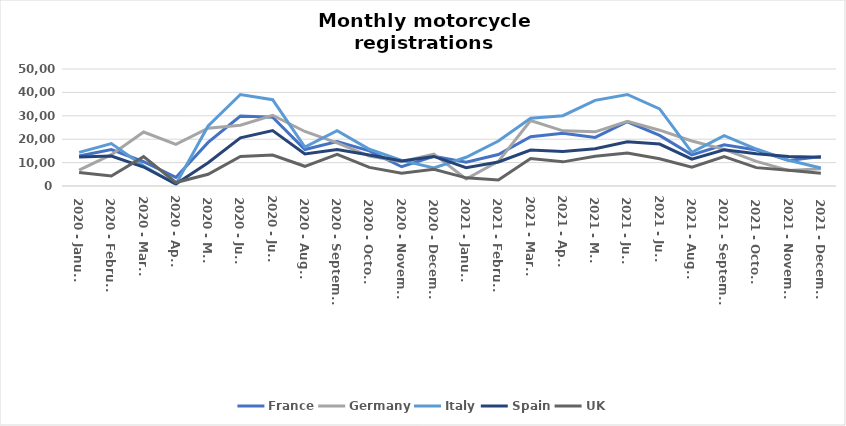
| Category | France | Germany | Italy | Spain | UK |
|---|---|---|---|---|---|
| 2020 - January | 12782 | 6827 | 14357 | 12352 | 5748 |
| 2020 - February | 15581 | 13392 | 18147 | 12823 | 4280 |
| 2020 - March | 10371 | 23074 | 8522 | 8100 | 12565 |
| 2020 - April | 3654 | 17763 | 811 | 817 | 1480 |
| 2020 - May | 18629 | 24681 | 25674 | 9918 | 5019 |
| 2020 - June | 29864 | 25970 | 39090 | 20589 | 12621 |
| 2020 - July | 29394 | 30228 | 36892 | 23718 | 13207 |
| 2020 - August | 15567 | 23296 | 16670 | 13690 | 8423 |
| 2020 - September | 18981 | 18397 | 23614 | 15637 | 13487 |
| 2020 - October | 15030 | 12775 | 15688 | 13206 | 7960 |
| 2020 - November | 8235 | 10351 | 10949 | 10672 | 5445 |
| 2020 - December | 12654 | 13672 | 7677 | 12636 | 7111 |
| 2021 - January | 10185 | 2979 | 12289 | 7801 | 3478 |
| 2021 - February | 13476 | 10545 | 19243 | 10287 | 2586 |
| 2021 - March | 21030 | 27982 | 28961 | 15369 | 11713 |
| 2021 - April | 22529 | 23583 | 30044 | 14722 | 10317 |
| 2021 - May | 20781 | 23158 | 36584 | 15926 | 12723 |
| 2021 - June | 27457 | 27636 | 39118 | 18885 | 14077 |
| 2021 - July | 21607 | 23854 | 32955 | 17926 | 11651 |
| 2021 - August | 13294 | 19241 | 14396 | 11440 | 8049 |
| 2021 - September | 17649 | 15645 | 21553 | 15516 | 12583 |
| 2021 - October | 15375 | 10542 | 15797 | 13747 | 7852 |
| 2021 - November | 10950 | 6639 | 10998 | 12630 | 6746 |
| 2021 - December | 12622 | 7328 | 7662 | 12264 | 5495 |